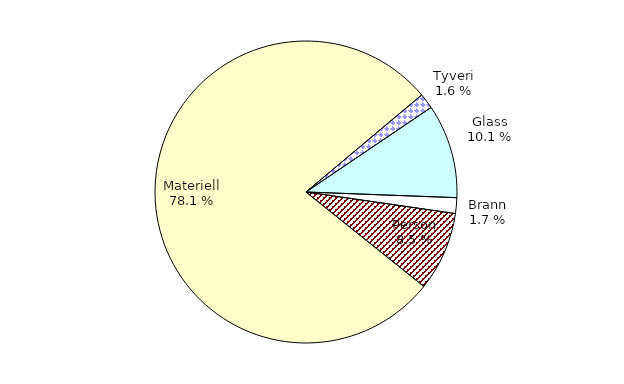
| Category | Series 0 |
|---|---|
| Tyveri | 261.105 |
| Glass | 1593.221 |
| Brann | 266.329 |
| Person | 1340.944 |
| Materiell | 12371.078 |